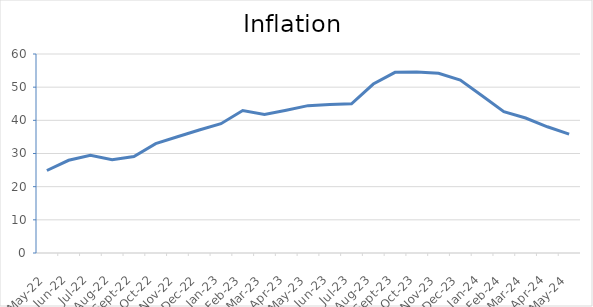
| Category | Inflation |
|---|---|
| 2022-05-01 | 24.87 |
| 2022-06-01 | 27.95 |
| 2022-07-01 | 29.47 |
| 2022-08-01 | 28.15 |
| 2022-09-01 | 29.1 |
| 2022-10-01 | 32.98 |
| 2022-11-01 | 35.05 |
| 2022-12-01 | 37.09 |
| 2023-01-01 | 38.99 |
| 2023-02-01 | 42.96 |
| 2023-03-01 | 41.74 |
| 2023-04-01 | 43.05 |
| 2023-05-01 | 44.43 |
| 2023-06-01 | 44.81 |
| 2023-07-01 | 44.98 |
| 2023-08-01 | 50.94 |
| 2023-09-01 | 54.48 |
| 2023-10-01 | 54.59 |
| 2023-11-01 | 54.2 |
| 2023-12-01 | 52.16 |
| 2024-01-01 | 47.42 |
| 2024-02-01 | 42.59 |
| 2024-03-01 | 40.69 |
| 2024-04-01 | 38.06 |
| 2024-05-01 | 35.84 |